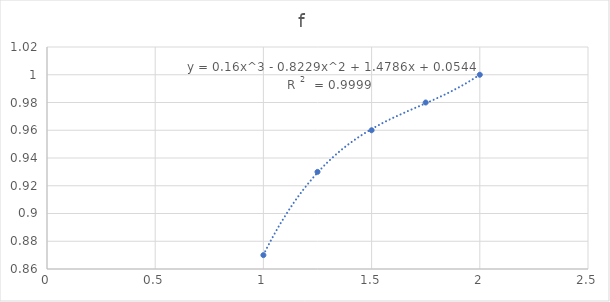
| Category | f |
|---|---|
| 2.0 | 1 |
| 1.75 | 0.98 |
| 1.5 | 0.96 |
| 1.25 | 0.93 |
| 1.0 | 0.87 |